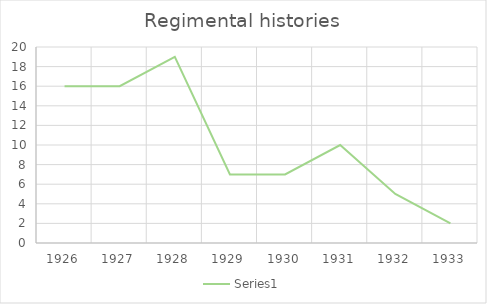
| Category | Series 0 |
|---|---|
| 1926.0 | 16 |
| 1927.0 | 16 |
| 1928.0 | 19 |
| 1929.0 | 7 |
| 1930.0 | 7 |
| 1931.0 | 10 |
| 1932.0 | 5 |
| 1933.0 | 2 |